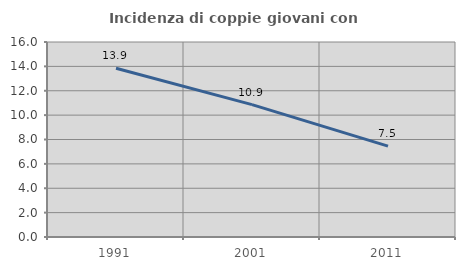
| Category | Incidenza di coppie giovani con figli |
|---|---|
| 1991.0 | 13.852 |
| 2001.0 | 10.861 |
| 2011.0 | 7.457 |